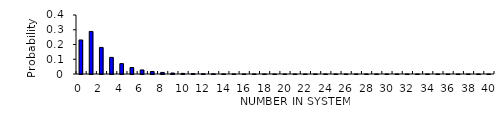
| Category | Series 0 |
|---|---|
| 0.0 | 0.231 |
| 1.0 | 0.288 |
| 2.0 | 0.18 |
| 3.0 | 0.113 |
| 4.0 | 0.07 |
| 5.0 | 0.044 |
| 6.0 | 0.028 |
| 7.0 | 0.017 |
| 8.0 | 0.011 |
| 9.0 | 0.007 |
| 10.0 | 0.004 |
| 11.0 | 0.003 |
| 12.0 | 0.002 |
| 13.0 | 0.001 |
| 14.0 | 0.001 |
| 15.0 | 0 |
| 16.0 | 0 |
| 17.0 | 0 |
| 18.0 | 0 |
| 19.0 | 0 |
| 20.0 | 0 |
| 21.0 | 0 |
| 22.0 | 0 |
| 23.0 | 0 |
| 24.0 | 0 |
| 25.0 | 0 |
| 26.0 | 0 |
| 27.0 | 0 |
| 28.0 | 0 |
| 29.0 | 0 |
| 30.0 | 0 |
| 31.0 | 0 |
| 32.0 | 0 |
| 33.0 | 0 |
| 34.0 | 0 |
| 35.0 | 0 |
| 36.0 | 0 |
| 37.0 | 0 |
| 38.0 | 0 |
| 39.0 | 0 |
| 40.0 | 0 |